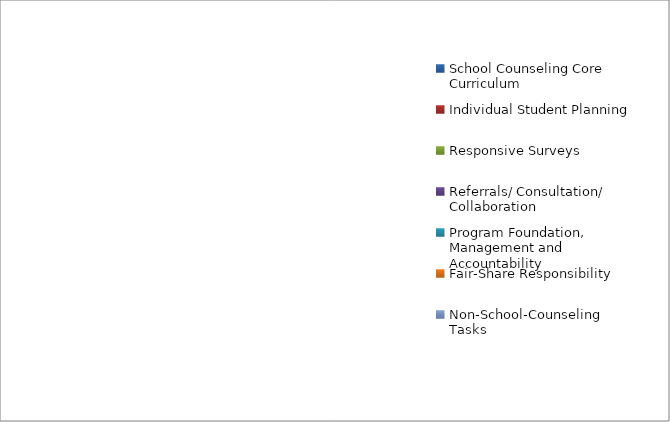
| Category | Series 0 |
|---|---|
| School Counseling Core Curriculum | 0 |
| Individual Student Planning | 0 |
| Responsive Surveys | 0 |
| Referrals/ Consultation/ Collaboration | 0 |
| ﻿Program Foundation, Management and Accountability | 0 |
| Fair-Share Responsibility | 0 |
| ﻿Non-School-Counseling Tasks | 0 |